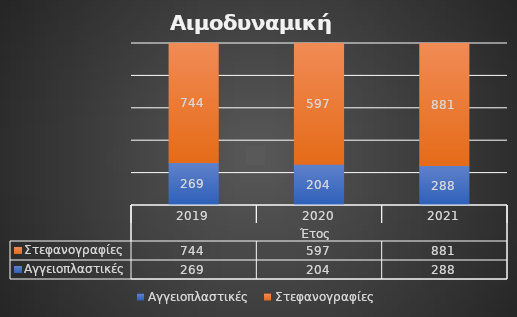
| Category | Αγγειοπλαστικές  | Στεφανογραφίες |
|---|---|---|
| 0 | 269 | 744 |
| 1 | 204 | 597 |
| 2 | 288 | 881 |